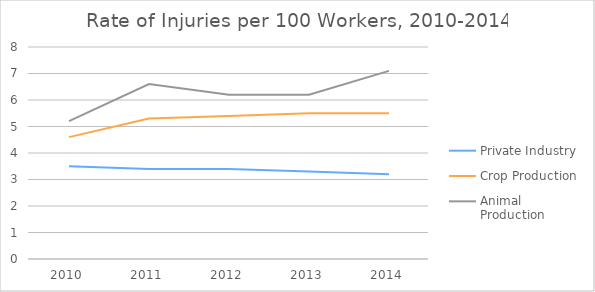
| Category | Private Industry | Crop Production | Animal Production |
|---|---|---|---|
| 2010.0 | 3.5 | 4.6 | 5.2 |
| 2011.0 | 3.4 | 5.3 | 6.6 |
| 2012.0 | 3.4 | 5.4 | 6.2 |
| 2013.0 | 3.3 | 5.5 | 6.2 |
| 2014.0 | 3.2 | 5.5 | 7.1 |